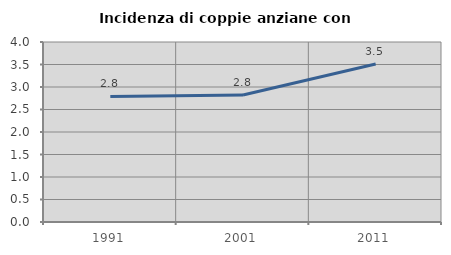
| Category | Incidenza di coppie anziane con figli |
|---|---|
| 1991.0 | 2.789 |
| 2001.0 | 2.822 |
| 2011.0 | 3.512 |